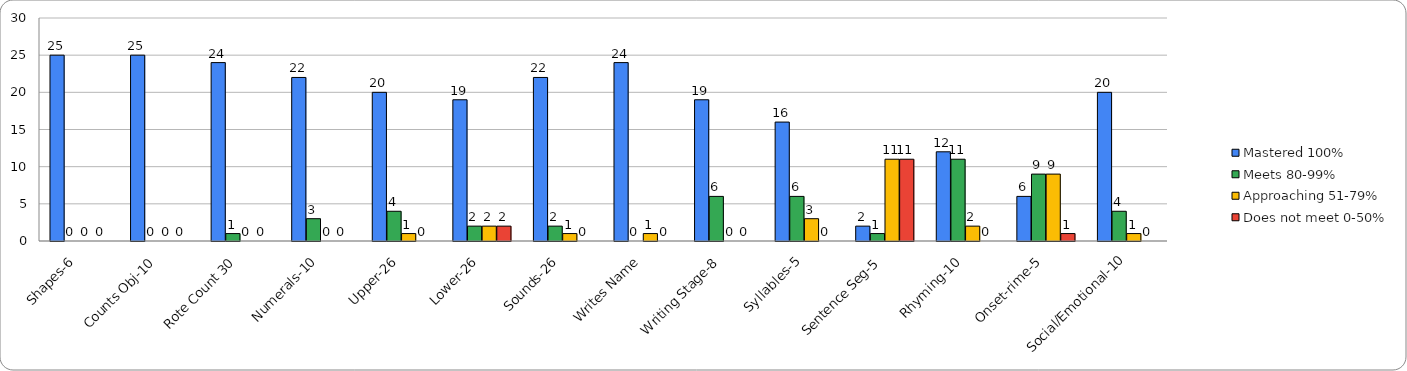
| Category | Mastered 100% | Meets 80-99% | Approaching 51-79% | Does not meet 0-50% |
|---|---|---|---|---|
| Shapes-6 | 25 | 0 | 0 | 0 |
| Counts Obj-10 | 25 | 0 | 0 | 0 |
| Rote Count 30 | 24 | 1 | 0 | 0 |
| Numerals-10 | 22 | 3 | 0 | 0 |
| Upper-26 | 20 | 4 | 1 | 0 |
| Lower-26 | 19 | 2 | 2 | 2 |
| Sounds-26 | 22 | 2 | 1 | 0 |
| Writes Name | 24 | 0 | 1 | 0 |
| Writing Stage-8 | 19 | 6 | 0 | 0 |
| Syllables-5 | 16 | 6 | 3 | 0 |
| Sentence Seg-5 | 2 | 1 | 11 | 11 |
| Rhyming-10 | 12 | 11 | 2 | 0 |
| Onset-rime-5 | 6 | 9 | 9 | 1 |
| Social/Emotional-10 | 20 | 4 | 1 | 0 |